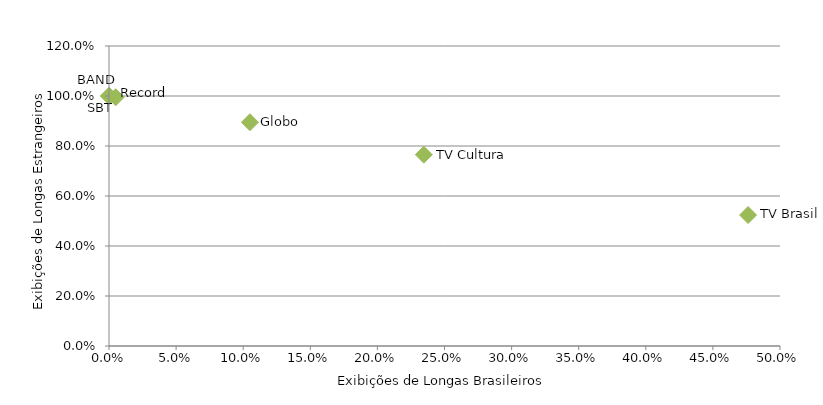
| Category | Series 0 |
|---|---|
| 0.10501193317422435 | 0.895 |
| 0.2345679012345679 | 0.765 |
| 0.47619047619047616 | 0.524 |
| 0.005 | 0.995 |
| 0.0 | 1 |
| 0.0 | 1 |